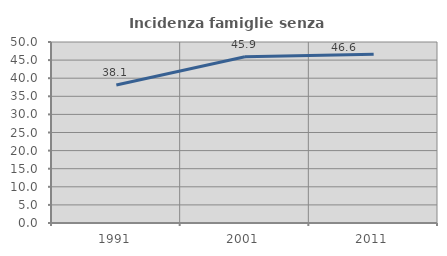
| Category | Incidenza famiglie senza nuclei |
|---|---|
| 1991.0 | 38.137 |
| 2001.0 | 45.936 |
| 2011.0 | 46.635 |